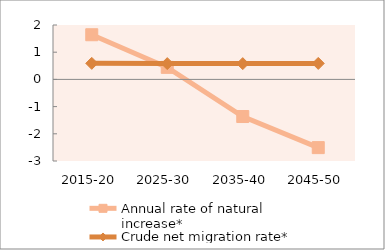
| Category | Annual rate of natural increase* | Crude net migration rate* |
|---|---|---|
| 2015-20 | 1.642 | 0.59 |
| 2025-30 | 0.443 | 0.581 |
| 2035-40 | -1.365 | 0.58 |
| 2045-50 | -2.508 | 0.588 |